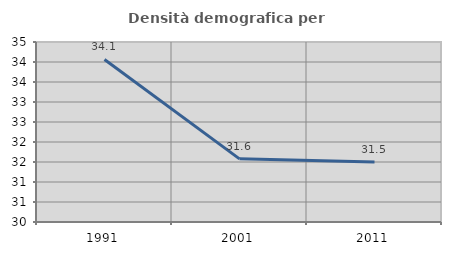
| Category | Densità demografica |
|---|---|
| 1991.0 | 34.064 |
| 2001.0 | 31.579 |
| 2011.0 | 31.497 |